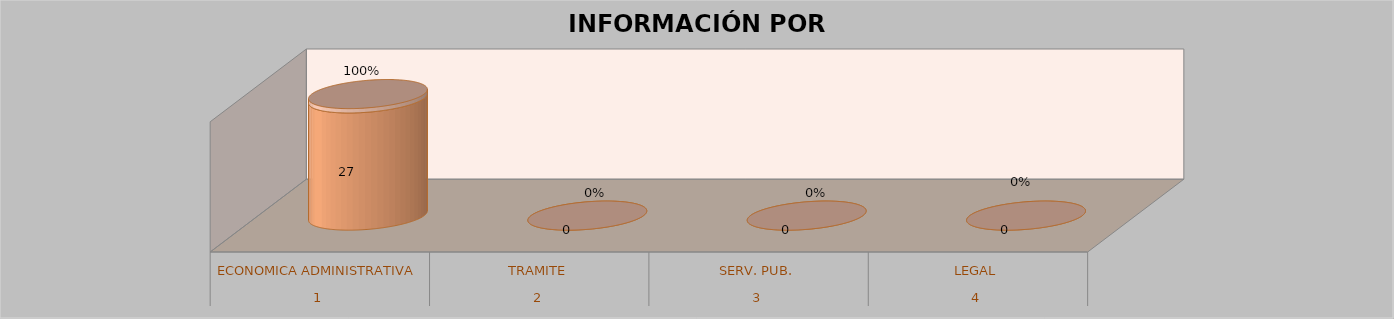
| Category | Series 0 | Series 1 | Series 2 | Series 3 |
|---|---|---|---|---|
| 0 |  |  | 27 | 1 |
| 1 |  |  | 0 | 0 |
| 2 |  |  | 0 | 0 |
| 3 |  |  | 0 | 0 |